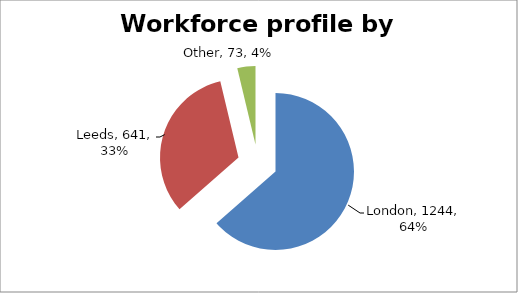
| Category | Series 0 |
|---|---|
| London | 1244 |
| Leeds | 641 |
| Other | 73 |